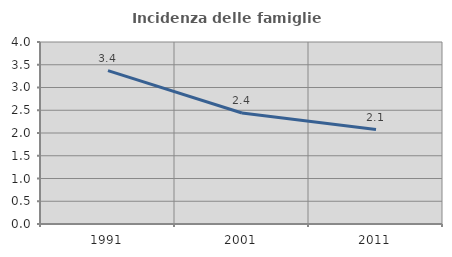
| Category | Incidenza delle famiglie numerose |
|---|---|
| 1991.0 | 3.372 |
| 2001.0 | 2.439 |
| 2011.0 | 2.077 |